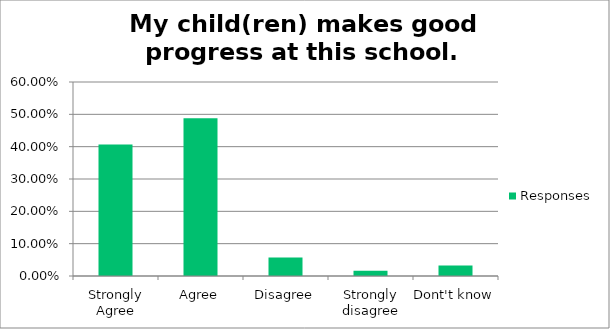
| Category | Responses |
|---|---|
| Strongly Agree | 0.406 |
| Agree | 0.488 |
| Disagree | 0.057 |
| Strongly disagree | 0.016 |
| Dont't know | 0.032 |